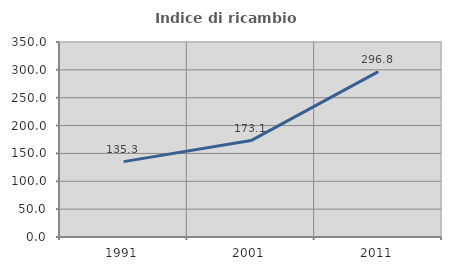
| Category | Indice di ricambio occupazionale  |
|---|---|
| 1991.0 | 135.262 |
| 2001.0 | 173.069 |
| 2011.0 | 296.827 |